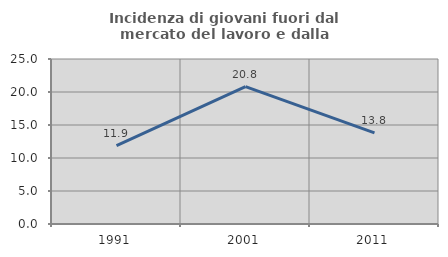
| Category | Incidenza di giovani fuori dal mercato del lavoro e dalla formazione  |
|---|---|
| 1991.0 | 11.869 |
| 2001.0 | 20.814 |
| 2011.0 | 13.816 |